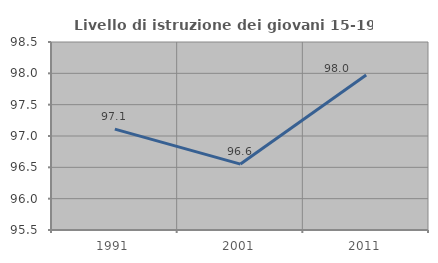
| Category | Livello di istruzione dei giovani 15-19 anni |
|---|---|
| 1991.0 | 97.11 |
| 2001.0 | 96.552 |
| 2011.0 | 97.973 |